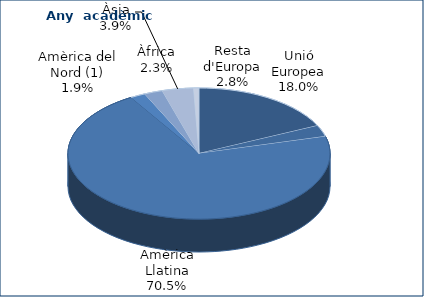
| Category | Series 0 |
|---|---|
| Unió Europea | 135 |
| Resta d'Europa | 21 |
| Amèrica Llatina | 529 |
| Amèrica del Nord (1) | 14 |
| Àfrica | 17 |
| Àsia | 29 |
| Oceania | 5 |